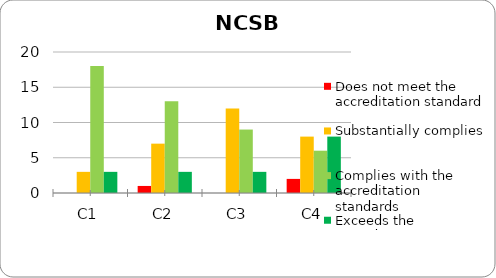
| Category | Does not meet the accreditation standard | Substantially complies | Complies with the accreditation standards | Exceeds the accreditation standards |
|---|---|---|---|---|
| C1 | 0 | 3 | 18 | 3 |
| C2 | 1 | 7 | 13 | 3 |
| C3 | 0 | 12 | 9 | 3 |
| C4 | 2 | 8 | 6 | 8 |